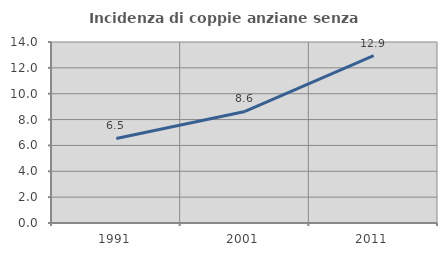
| Category | Incidenza di coppie anziane senza figli  |
|---|---|
| 1991.0 | 6.539 |
| 2001.0 | 8.627 |
| 2011.0 | 12.948 |